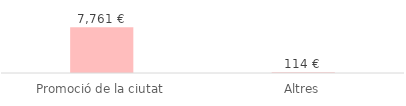
| Category | Total |
|---|---|
| Promoció de la ciutat | 7760.94 |
| Altres | 114.4 |